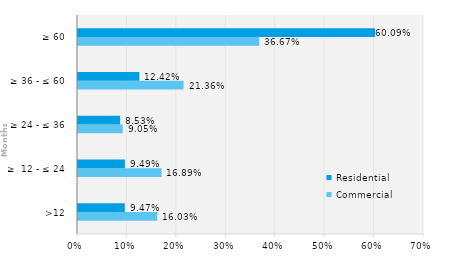
| Category | Commercial | Residential |
|---|---|---|
| >12 | 0.16 | 0.095 |
| ≥  12 - ≤ 24 | 0.169 | 0.095 |
| ≥ 24 - ≤ 36 | 0.09 | 0.085 |
| ≥ 36 - ≤ 60 | 0.214 | 0.124 |
| ≥ 60 | 0.367 | 0.601 |